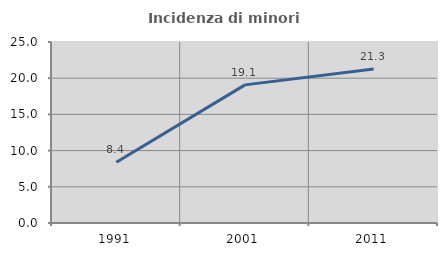
| Category | Incidenza di minori stranieri |
|---|---|
| 1991.0 | 8.379 |
| 2001.0 | 19.079 |
| 2011.0 | 21.258 |